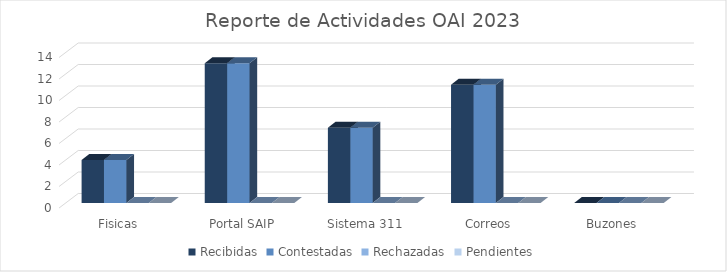
| Category | Recibidas | Contestadas | Rechazadas | Pendientes |
|---|---|---|---|---|
| Fisicas | 4 | 4 | 0 | 0 |
| Portal SAIP | 13 | 13 | 0 | 0 |
| Sistema 311 | 7 | 7 | 0 | 0 |
| Correos | 11 | 11 | 0 | 0 |
| Buzones | 0 | 0 | 0 | 0 |